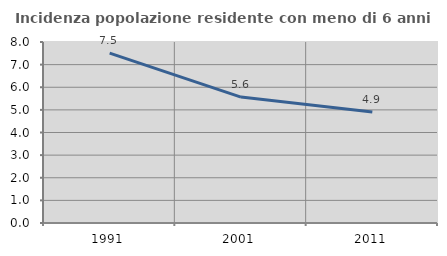
| Category | Incidenza popolazione residente con meno di 6 anni |
|---|---|
| 1991.0 | 7.512 |
| 2001.0 | 5.565 |
| 2011.0 | 4.903 |